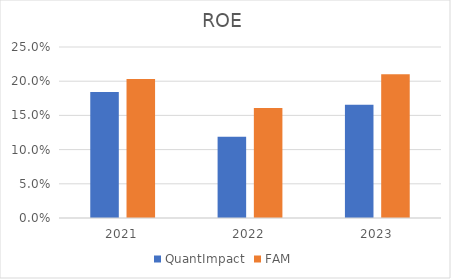
| Category | QuantImpact | FAM |
|---|---|---|
| 2021.0 | 0.184 | 0.203 |
| 2022.0 | 0.119 | 0.161 |
| 2023.0 | 0.166 | 0.21 |